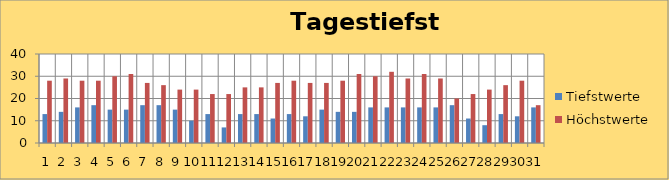
| Category | Tiefstwerte | Höchstwerte |
|---|---|---|
| 0 | 13 | 28 |
| 1 | 14 | 29 |
| 2 | 16 | 28 |
| 3 | 17 | 28 |
| 4 | 15 | 30 |
| 5 | 15 | 31 |
| 6 | 17 | 27 |
| 7 | 17 | 26 |
| 8 | 15 | 24 |
| 9 | 10 | 24 |
| 10 | 13 | 22 |
| 11 | 7 | 22 |
| 12 | 13 | 25 |
| 13 | 13 | 25 |
| 14 | 11 | 27 |
| 15 | 13 | 28 |
| 16 | 12 | 27 |
| 17 | 15 | 27 |
| 18 | 14 | 28 |
| 19 | 14 | 31 |
| 20 | 16 | 30 |
| 21 | 16 | 32 |
| 22 | 16 | 29 |
| 23 | 16 | 31 |
| 24 | 16 | 29 |
| 25 | 17 | 20 |
| 26 | 11 | 22 |
| 27 | 8 | 24 |
| 28 | 13 | 26 |
| 29 | 12 | 28 |
| 30 | 16 | 17 |